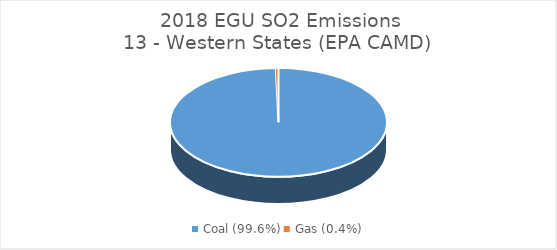
| Category | SO2 |
|---|---|
| Coal (99.6%) | 127034.044 |
| Gas (0.4%) | 513.702 |